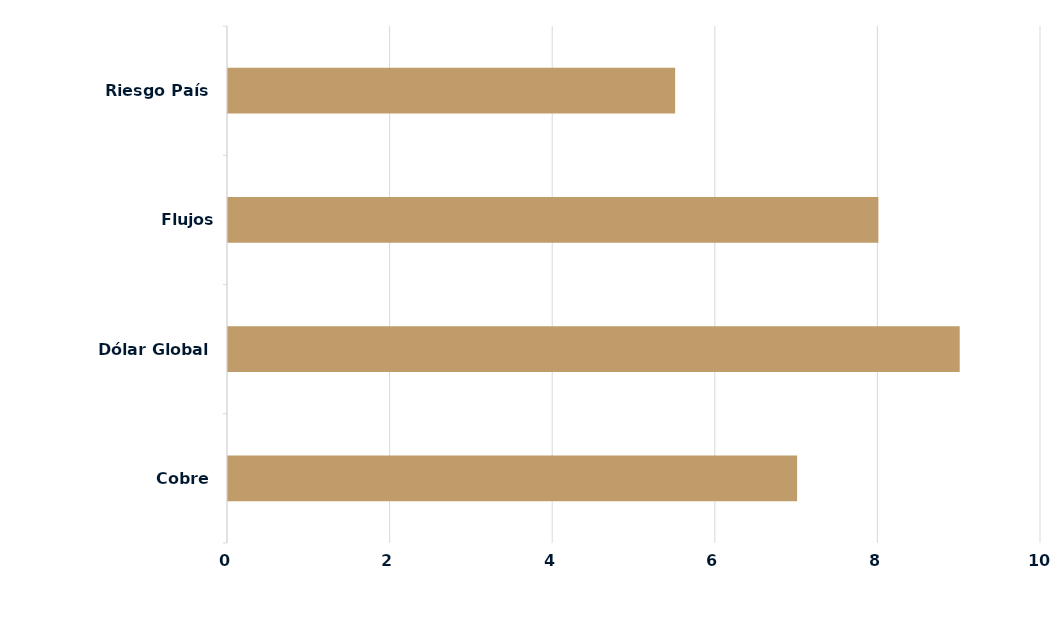
| Category | Series 0 |
|---|---|
| Cobre | 7 |
| Dólar Global | 9 |
| Flujos Locales/Extranjeros | 8 |
| Riesgo País | 5.5 |